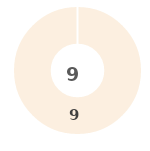
| Category | Series 0 |
|---|---|
| 0 | 0 |
| 1 | 0 |
| 2 | 0 |
| 3 | 0 |
| 4 | 9 |